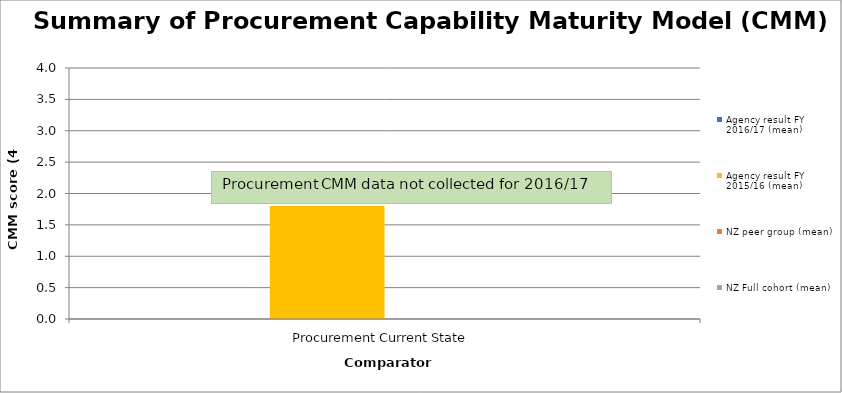
| Category | Agency result FY 2016/17 (mean) | Agency result FY 2015/16 (mean) | NZ peer group (mean) | NZ Full cohort (mean) |
|---|---|---|---|---|
| Procurement Current State | 0 | 1.8 | 0 | 0 |